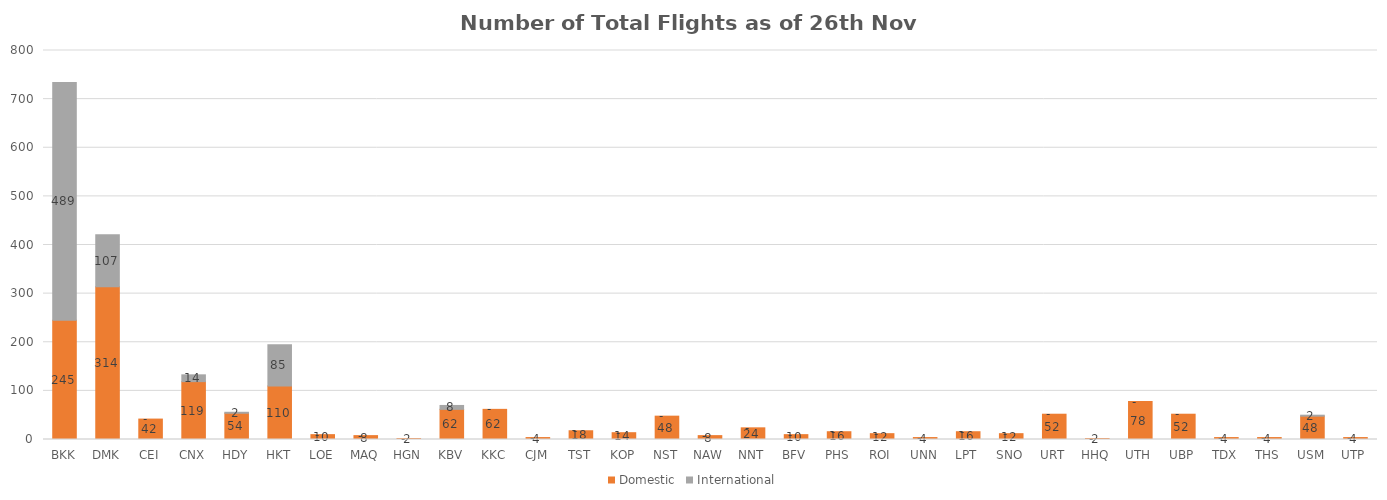
| Category | Domestic | International |
|---|---|---|
| BKK | 245 | 489 |
| DMK | 314 | 107 |
| CEI | 42 | 0 |
| CNX | 119 | 14 |
| HDY | 54 | 2 |
| HKT | 110 | 85 |
| LOE | 10 | 0 |
| MAQ | 8 | 0 |
| HGN | 2 | 0 |
| KBV | 62 | 8 |
| KKC | 62 | 0 |
| CJM | 4 | 0 |
| TST | 18 | 0 |
| KOP | 14 | 0 |
| NST | 48 | 0 |
| NAW | 8 | 0 |
| NNT | 24 | 0 |
| BFV | 10 | 0 |
| PHS | 16 | 0 |
| ROI | 12 | 0 |
| UNN | 4 | 0 |
| LPT | 16 | 0 |
| SNO | 12 | 0 |
| URT | 52 | 0 |
| HHQ | 2 | 0 |
| UTH | 78 | 0 |
| UBP | 52 | 0 |
| TDX | 4 | 0 |
| THS | 4 | 0 |
| USM | 48 | 2 |
| UTP | 4 | 0 |